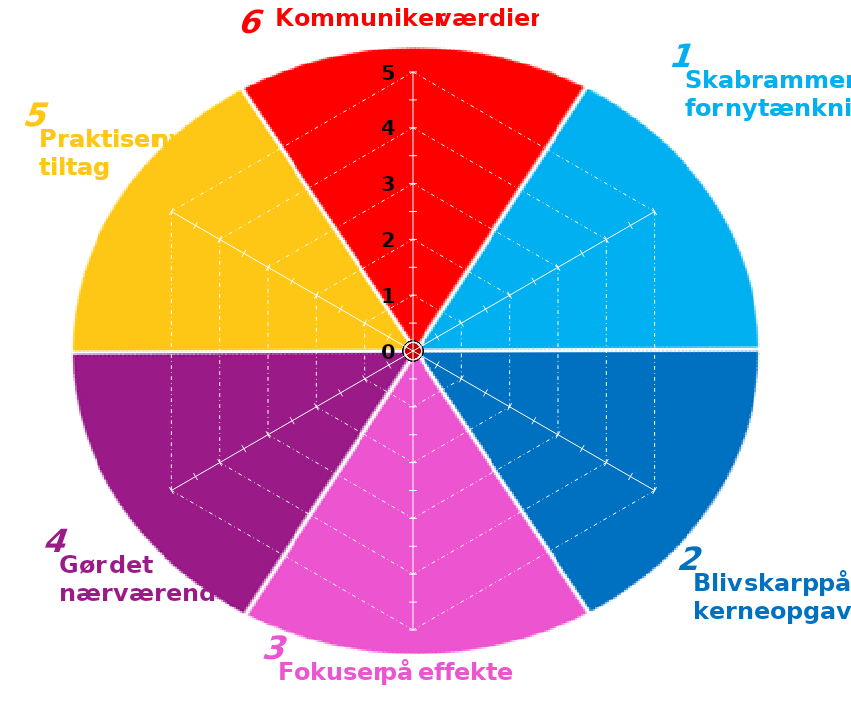
| Category | gnt alle | led |
|---|---|---|
| 0 | 0 | 0 |
| 1 | 0 | 0 |
| 2 | 0 | 0 |
| 3 | 0 | 0 |
| 4 | 0 | 0 |
| 5 | 0 | 0 |